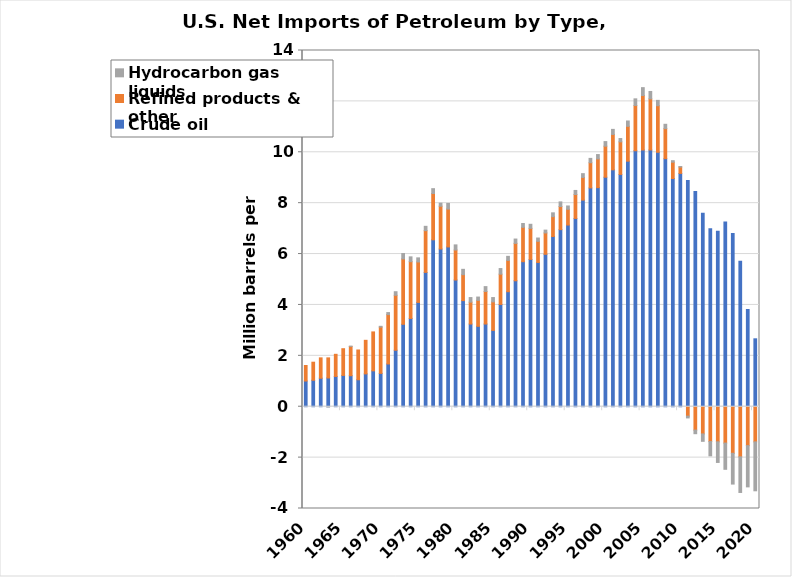
| Category | Crude oil | Refined products & other | Hydrocarbon gas liquids |
|---|---|---|---|
| 1960.0 | 1.01 | 0.61 | 0 |
| 1961.0 | 1.04 | 0.71 | 0 |
| 1962.0 | 1.12 | 0.8 | 0 |
| 1963.0 | 1.13 | 0.79 | -0.01 |
| 1964.0 | 1.19 | 0.87 | 0 |
| 1965.0 | 1.23 | 1.05 | 0 |
| 1966.0 | 1.22 | 1.15 | 0.01 |
| 1967.0 | 1.06 | 1.17 | 0 |
| 1968.0 | 1.29 | 1.32 | 0 |
| 1969.0 | 1.41 | 1.53 | 0 |
| 1970.0 | 1.31 | 1.82 | 0.03 |
| 1971.0 | 1.68 | 1.94 | 0.08 |
| 1972.0 | 2.22 | 2.16 | 0.14 |
| 1973.0 | 3.24 | 2.57 | 0.21 |
| 1974.0 | 3.47 | 2.23 | 0.19 |
| 1975.0 | 4.1 | 1.59 | 0.16 |
| 1976.0 | 5.28 | 1.64 | 0.17 |
| 1977.0 | 6.56 | 1.82 | 0.19 |
| 1978.0 | 6.2 | 1.68 | 0.12 |
| 1979.0 | 6.28 | 1.49 | 0.22 |
| 1980.0 | 4.98 | 1.18 | 0.2 |
| 1981.0 | 4.17 | 1.02 | 0.21 |
| 1982.0 | 3.25 | 0.86 | 0.18 |
| 1983.0 | 3.16 | 1.02 | 0.13 |
| 1984.0 | 3.25 | 1.28 | 0.19 |
| 1985.0 | 3 | 1.12 | 0.17 |
| 1986.0 | 4.02 | 1.19 | 0.22 |
| 1987.0 | 4.52 | 1.23 | 0.16 |
| 1988.0 | 4.95 | 1.47 | 0.17 |
| 1989.0 | 5.7 | 1.35 | 0.15 |
| 1990.0 | 5.79 | 1.22 | 0.16 |
| 1991.0 | 5.67 | 0.83 | 0.13 |
| 1992.0 | 5.99 | 0.84 | 0.11 |
| 1993.0 | 6.69 | 0.78 | 0.15 |
| 1994.0 | 6.96 | 0.91 | 0.18 |
| 1995.0 | 7.14 | 0.62 | 0.13 |
| 1996.0 | 7.4 | 0.94 | 0.16 |
| 1997.0 | 8.12 | 0.89 | 0.15 |
| 1998.0 | 8.6 | 0.99 | 0.17 |
| 1999.0 | 8.61 | 1.13 | 0.17 |
| 2000.0 | 9.02 | 1.22 | 0.18 |
| 2001.0 | 9.31 | 1.39 | 0.2 |
| 2002.0 | 9.13 | 1.28 | 0.13 |
| 2003.0 | 9.65 | 1.37 | 0.21 |
| 2004.0 | 10.06 | 1.78 | 0.26 |
| 2005.0 | 10.09 | 2.14 | 0.31 |
| 2006.0 | 10.09 | 2.01 | 0.29 |
| 2007.0 | 10 | 1.83 | 0.21 |
| 2008.0 | 9.75 | 1.18 | 0.17 |
| 2009.0 | 8.97 | 0.64 | 0.06 |
| 2010.0 | 9.17 | 0.25 | 0.02 |
| 2011.0 | 8.89 | -0.37 | -0.07 |
| 2012.0 | 8.46 | -0.92 | -0.14 |
| 2013.0 | 7.6 | -1.07 | -0.29 |
| 2014.0 | 6.99 | -1.37 | -0.56 |
| 2015.0 | 6.9 | -1.38 | -0.81 |
| 2016.0 | 7.26 | -1.43 | -1.03 |
| 2017.0 | 6.81 | -1.83 | -1.21 |
| 2018.0 | 5.72 | -1.97 | -1.4 |
| 2019.0 | 3.82 | -1.53 | -1.62 |
| 2020.0 | 2.669 | -1.383 | -1.921 |